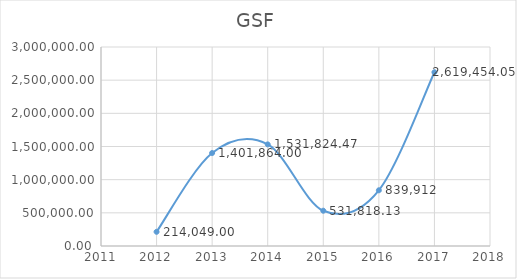
| Category | GSF |
|---|---|
| 2012.0 | 214049 |
| 2013.0 | 1401864 |
| 2014.0 | 1531824.47 |
| 2015.0 | 531818.13 |
| 2016.0 | 839912 |
| 2017.0 | 2619454.05 |